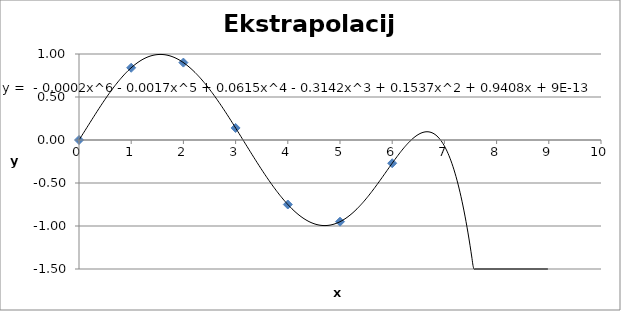
| Category | Series 0 |
|---|---|
| 0.0 | 0 |
| 1.0 | 0.84 |
| 2.0 | 0.9 |
| 3.0 | 0.14 |
| 4.0 | -0.75 |
| 5.0 | -0.95 |
| 6.0 | -0.27 |